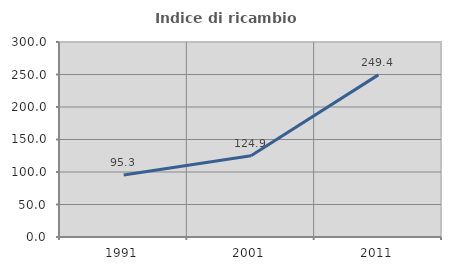
| Category | Indice di ricambio occupazionale  |
|---|---|
| 1991.0 | 95.289 |
| 2001.0 | 124.874 |
| 2011.0 | 249.442 |